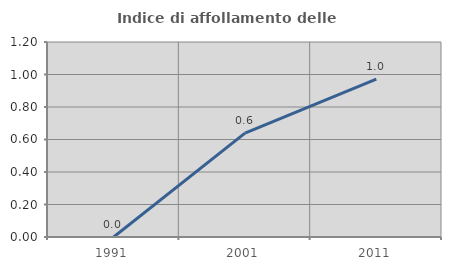
| Category | Indice di affollamento delle abitazioni  |
|---|---|
| 1991.0 | 0 |
| 2001.0 | 0.639 |
| 2011.0 | 0.971 |